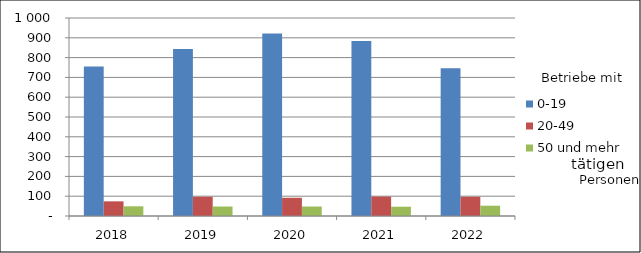
| Category | 0-19 | 20-49 | 50 und mehr |
|---|---|---|---|
| 2018.0 | 755 | 74 | 49 |
| 2019.0 | 844 | 97 | 48 |
| 2020.0 | 922 | 92 | 48 |
| 2021.0 | 884 | 98 | 47 |
| 2022.0 | 746 | 97 | 52 |